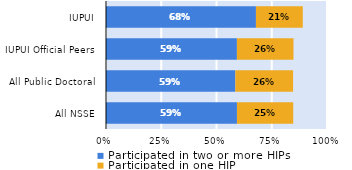
| Category | Participated in two or more HIPs | Participated in one HIP |
|---|---|---|
| All NSSE | 0.593 | 0.255 |
| All Public Doctoral | 0.585 | 0.262 |
| IUPUI Official Peers | 0.592 | 0.256 |
| IUPUI | 0.678 | 0.212 |